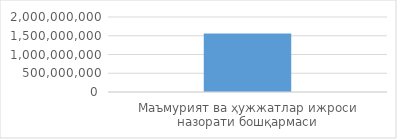
| Category | Товар / хизматнинг
жами суммаси
(cумда) 
(ҚҚС билан) |
|---|---|
| Маъмурият ва ҳужжатлар ижроси назорати бошқармаси | 1561800000 |